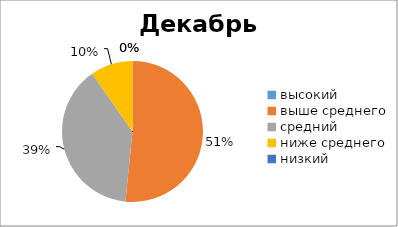
| Category | Series 0 |
|---|---|
| высокий | 0 |
| выше среднего | 16 |
| средний | 12 |
| ниже среднего | 3 |
| низкий | 0 |